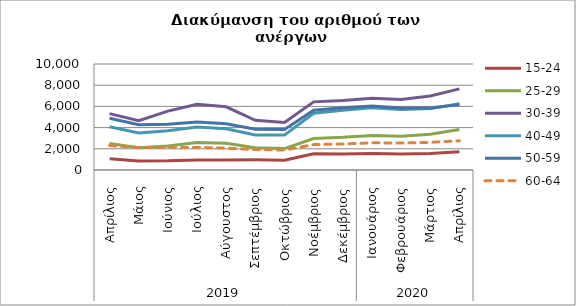
| Category | 15-24 | 25-29 | 30-39 | 40-49 | 50-59 | 60-64 |
|---|---|---|---|---|---|---|
| 0 | 1065 | 2512 | 5317 | 4088 | 4875 | 2307 |
| 1 | 855 | 2089 | 4649 | 3486 | 4277 | 2115 |
| 2 | 865 | 2260 | 5554 | 3710 | 4325 | 2110 |
| 3 | 937 | 2588 | 6199 | 4067 | 4524 | 2132 |
| 4 | 950 | 2528 | 5962 | 3895 | 4356 | 2062 |
| 5 | 960 | 2109 | 4687 | 3310 | 3846 | 1924 |
| 6 | 919 | 2022 | 4478 | 3293 | 3811 | 1886 |
| 7 | 1537 | 2970 | 6427 | 5355 | 5640 | 2393 |
| 8 | 1503 | 3082 | 6550 | 5646 | 5873 | 2456 |
| 9 | 1553 | 3257 | 6759 | 5874 | 6042 | 2564 |
| 10 | 1509 | 3191 | 6656 | 5700 | 5841 | 2544 |
| 11 | 1555 | 3375 | 6990 | 5790 | 5839 | 2611 |
| 12 | 1729 | 3820 | 7653 | 6252 | 6167 | 2755 |